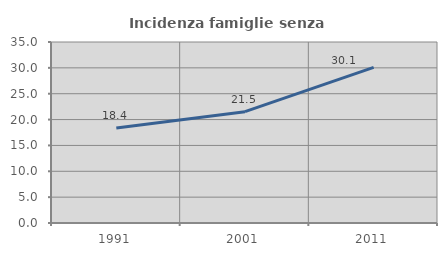
| Category | Incidenza famiglie senza nuclei |
|---|---|
| 1991.0 | 18.391 |
| 2001.0 | 21.521 |
| 2011.0 | 30.097 |